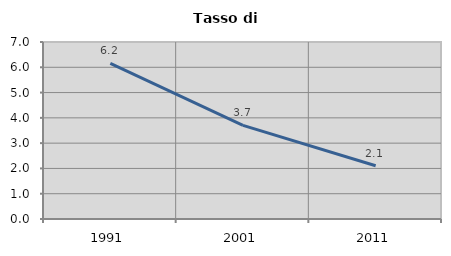
| Category | Tasso di disoccupazione   |
|---|---|
| 1991.0 | 6.154 |
| 2001.0 | 3.704 |
| 2011.0 | 2.105 |